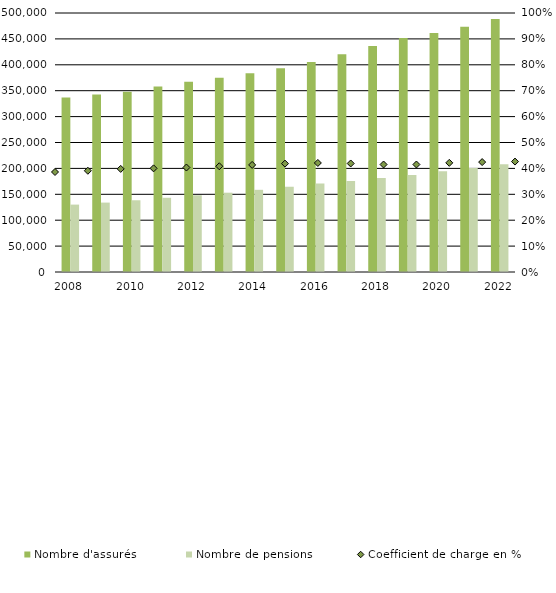
| Category | Nombre d'assurés  | Nombre de pensions |
|---|---|---|
| 2008.0 | 336993 | 130114 |
| 2009.0 | 342781 | 133995 |
| 2010.0 | 347887 | 138483 |
| 2011.0 | 357934 | 143249 |
| 2012.0 | 367292 | 148157 |
| 2013.0 | 374925 | 153080 |
| 2014.0 | 383755.5 | 158645 |
| 2015.0 | 393509.5 | 164678.75 |
| 2016.0 | 405583 | 170618 |
| 2017.0 | 420162 | 175893 |
| 2018.0 | 436318 | 181281 |
| 2019.0 | 451824 | 187412 |
| 2020.0 | 461345 | 194441 |
| 2021.0 | 473508 | 200974 |
| 2022.0 | 488361 | 208212.167 |